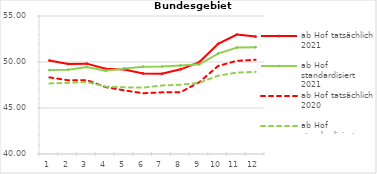
| Category | ab Hof tatsächlich 2021 | ab Hof standardisiert 2021 | ab Hof tatsächlich 2020 | ab Hof standardisiert 2020 |
|---|---|---|---|---|
| 0 | 50.164 | 49.122 | 48.329 | 47.672 |
| 1 | 49.785 | 49.167 | 48.013 | 47.73 |
| 2 | 49.823 | 49.448 | 48.029 | 47.825 |
| 3 | 49.269 | 49.057 | 47.272 | 47.327 |
| 4 | 49.192 | 49.302 | 46.914 | 47.251 |
| 5 | 48.755 | 49.485 | 46.604 | 47.209 |
| 6 | 48.723 | 49.516 | 46.702 | 47.452 |
| 7 | 49.201 | 49.625 | 46.721 | 47.523 |
| 8 | 49.993 | 49.75 | 47.81 | 47.745 |
| 9 | 51.981 | 50.917 | 49.574 | 48.511 |
| 10 | 52.982 | 51.583 | 50.129 | 48.852 |
| 11 | 52.764 | 51.609 | 50.241 | 48.929 |